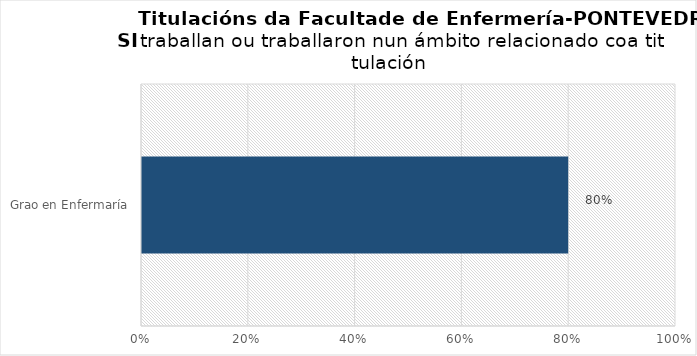
| Category | Series 0 |
|---|---|
| Grao en Enfermaría | 0.8 |